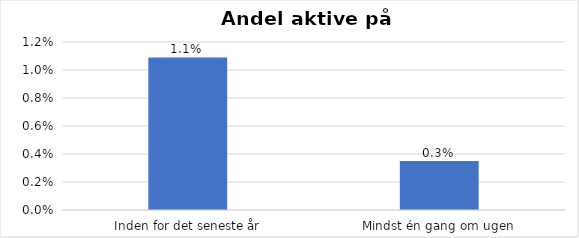
| Category | % |
|---|---|
| Inden for det seneste år | 0.011 |
| Mindst én gang om ugen | 0.003 |